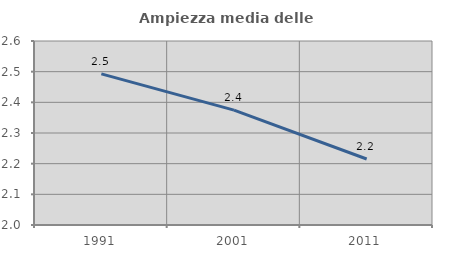
| Category | Ampiezza media delle famiglie |
|---|---|
| 1991.0 | 2.493 |
| 2001.0 | 2.375 |
| 2011.0 | 2.215 |